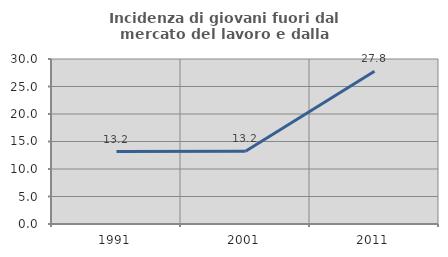
| Category | Incidenza di giovani fuori dal mercato del lavoro e dalla formazione  |
|---|---|
| 1991.0 | 13.163 |
| 2001.0 | 13.218 |
| 2011.0 | 27.778 |